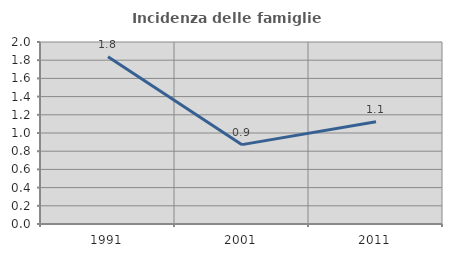
| Category | Incidenza delle famiglie numerose |
|---|---|
| 1991.0 | 1.839 |
| 2001.0 | 0.872 |
| 2011.0 | 1.123 |